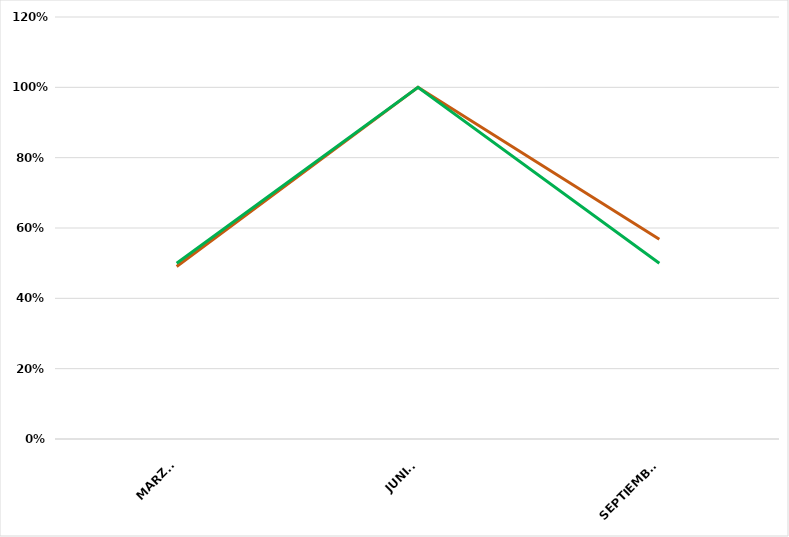
| Category | VALOR  | META PONDERADA |
|---|---|---|
| MARZO | 0.491 | 0.5 |
| JUNIO | 1 | 1 |
| SEPTIEMBRE | 0.568 | 0.5 |